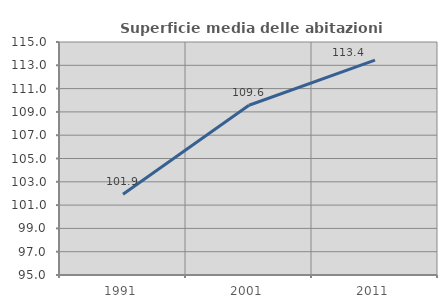
| Category | Superficie media delle abitazioni occupate |
|---|---|
| 1991.0 | 101.927 |
| 2001.0 | 109.569 |
| 2011.0 | 113.442 |